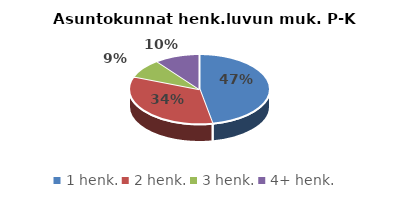
| Category | Series 0 |
|---|---|
| 1 henk. | 39397 |
| 2 henk. | 28359 |
| 3 henk. | 7331 |
| 4+ henk. | 8674 |